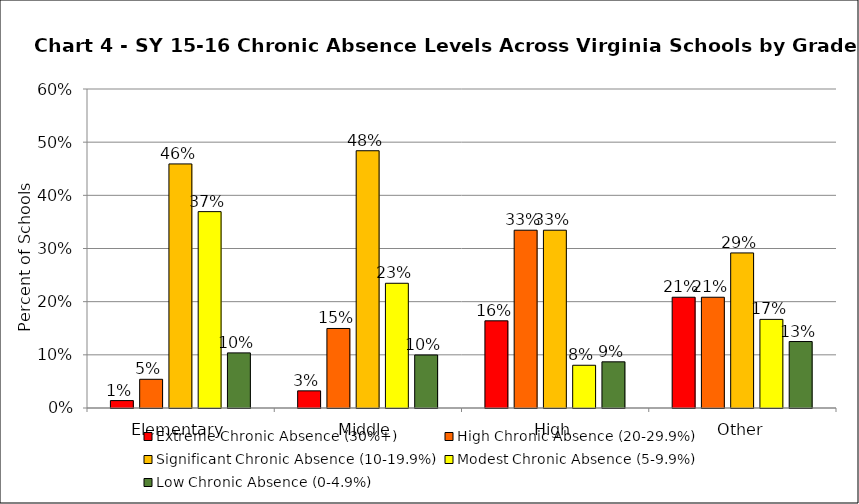
| Category | Extreme Chronic Absence (30%+) | High Chronic Absence (20-29.9%) | Significant Chronic Absence (10-19.9%) | Modest Chronic Absence (5-9.9%) | Low Chronic Absence (0-4.9%) |
|---|---|---|---|---|---|
| 0 | 0.014 | 0.054 | 0.459 | 0.369 | 0.104 |
| 1 | 0.032 | 0.15 | 0.484 | 0.235 | 0.1 |
| 2 | 0.164 | 0.334 | 0.334 | 0.08 | 0.087 |
| 3 | 0.208 | 0.208 | 0.292 | 0.167 | 0.125 |